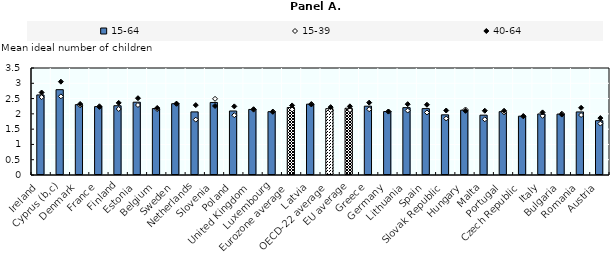
| Category | 15-64 |
|---|---|
| Ireland | 2.619 |
| Cyprus (b,c) | 2.791 |
| Denmark | 2.302 |
| France | 2.237 |
| Finland | 2.266 |
| Estonia | 2.382 |
| Belgium | 2.174 |
| Sweden | 2.332 |
| Netherlands | 2.064 |
| Slovenia | 2.373 |
| Poland | 2.094 |
| United Kingdom | 2.144 |
| Luxembourg | 2.071 |
| Eurozone average | 2.207 |
| Latvia | 2.317 |
| OECD-22 average | 2.17 |
| EU average | 2.184 |
| Greece | 2.251 |
| Germany | 2.075 |
| Lithuania | 2.203 |
| Spain | 2.171 |
| Slovak Republic | 1.968 |
| Hungary | 2.121 |
| Malta | 1.958 |
| Portugal | 2.072 |
| Czech Republic | 1.924 |
| Italy | 1.997 |
| Bulgaria | 1.992 |
| Romania | 2.063 |
| Austria | 1.778 |